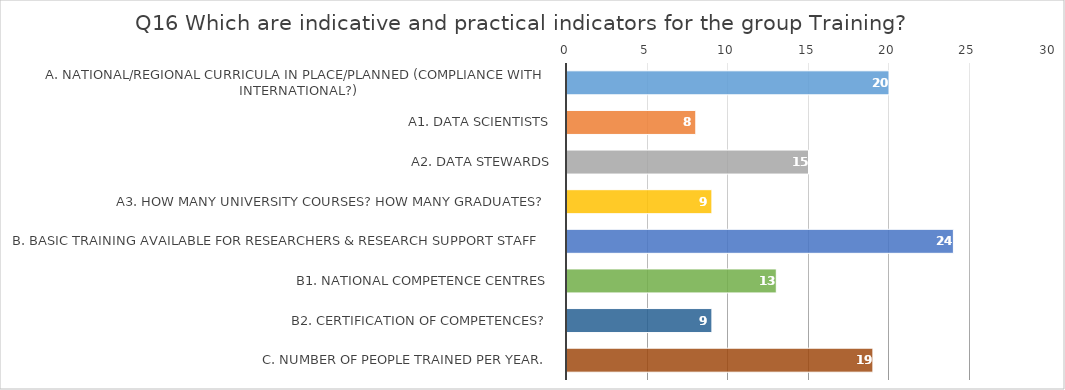
| Category | Series 0 |
|---|---|
| A. National/regional curricula in place/planned (compliance with international?) | 20 |
| a1. Data scientists | 8 |
| a2. Data stewards | 15 |
| a3. How many university courses? How many graduates? | 9 |
| B. Basic training available for researchers & research support staff | 24 |
| b1. National competence centres | 13 |
| b2. Certification of competences? | 9 |
| C. Number of people trained per year. | 19 |